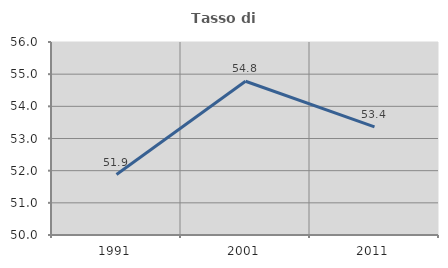
| Category | Tasso di occupazione   |
|---|---|
| 1991.0 | 51.88 |
| 2001.0 | 54.78 |
| 2011.0 | 53.359 |